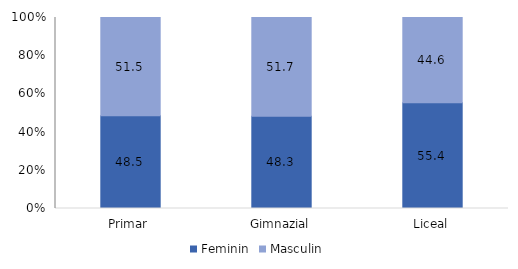
| Category | Feminin | Masculin |
|---|---|---|
| Primar | 48.5 | 51.5 |
| Gimnazial | 48.3 | 51.7 |
| Liceal | 55.4 | 44.6 |